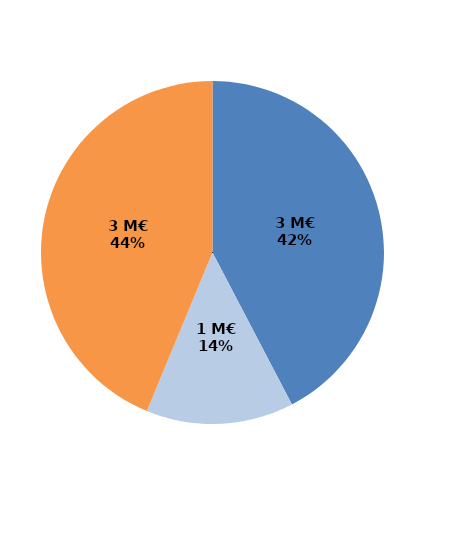
| Category | Series 0 |
|---|---|
| Formations certifiantes et pré-certifiantes | 3.269 |
| Formations professionnalisantes | 1.075 |
| Formations d'insertion sociale et professionnelle | 3.379 |